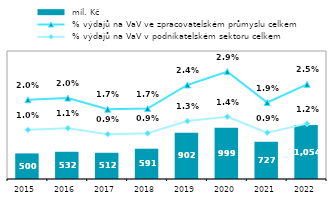
| Category |  mil. Kč |
|---|---|
| 2015.0 | 499.552 |
| 2016.0 | 531.732 |
| 2017.0 | 512.334 |
| 2018.0 | 591.173 |
| 2019.0 | 901.621 |
| 2020.0 | 998.727 |
| 2021.0 | 727.253 |
| 2022.0 | 1053.542 |